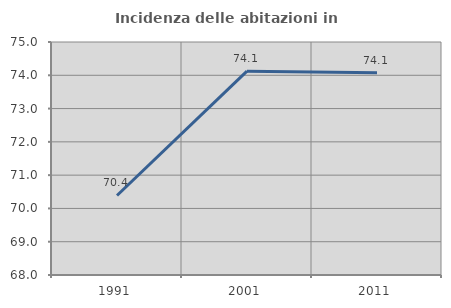
| Category | Incidenza delle abitazioni in proprietà  |
|---|---|
| 1991.0 | 70.389 |
| 2001.0 | 74.123 |
| 2011.0 | 74.073 |